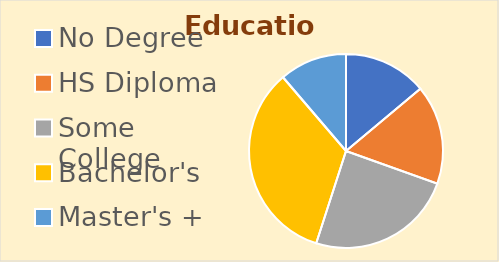
| Category | Series 0 |
|---|---|
| No Degree | 21 |
| HS Diploma | 25 |
| Some College | 37 |
| Bachelor's | 51 |
| Master's + | 17 |